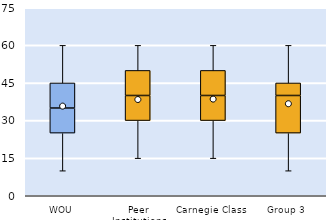
| Category | 25th | 50th | 75th |
|---|---|---|---|
| WOU | 25 | 10 | 10 |
| Peer Institutions | 30 | 10 | 10 |
| Carnegie Class | 30 | 10 | 10 |
| Group 3 | 25 | 15 | 5 |